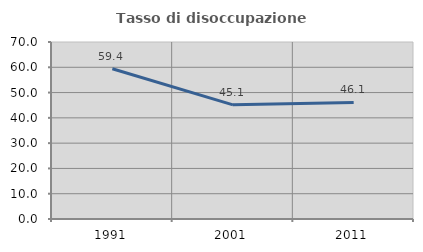
| Category | Tasso di disoccupazione giovanile  |
|---|---|
| 1991.0 | 59.404 |
| 2001.0 | 45.146 |
| 2011.0 | 46.111 |